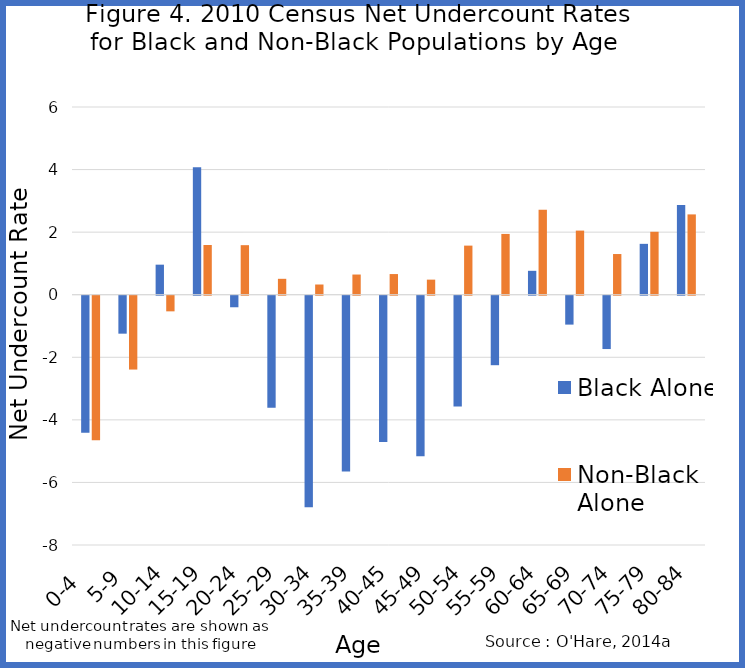
| Category | Black Alone | Non-Black Alone |
|---|---|---|
| 0-4  | -4.382 | -4.617 |
| 5-9 | -1.213 | -2.36 |
| 10-14 | 0.96 | -0.5 |
| 15-19 | 4.078 | 1.59 |
| 20-24 | -0.369 | 1.584 |
| 25-29 | -3.577 | 0.508 |
| 30-34 | -6.764 | 0.326 |
| 35-39 | -5.616 | 0.645 |
| 40-45 | -4.676 | 0.66 |
| 45-49 | -5.134 | 0.482 |
| 50-54 | -3.539 | 1.569 |
| 55-59 | -2.221 | 1.943 |
| 60-64 | 0.764 | 2.714 |
| 65-69 | -0.924 | 2.049 |
| 70-74 | -1.705 | 1.3 |
| 75-79 | 1.626 | 2.012 |
| 80-84 | 2.864 | 2.567 |